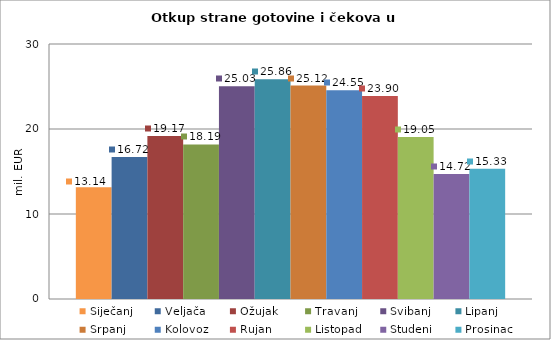
| Category | Siječanj | Veljača | Ožujak | Travanj | Svibanj | Lipanj | Srpanj | Kolovoz | Rujan | Listopad | Studeni | Prosinac |
|---|---|---|---|---|---|---|---|---|---|---|---|---|
| 0 | 13.139 | 16.719 | 19.174 | 18.189 | 25.033 | 25.859 | 25.117 | 24.552 | 23.896 | 19.046 | 14.719 | 15.328 |